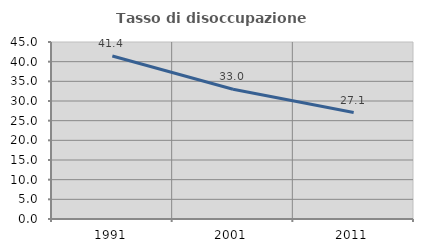
| Category | Tasso di disoccupazione giovanile  |
|---|---|
| 1991.0 | 41.436 |
| 2001.0 | 33 |
| 2011.0 | 27.059 |